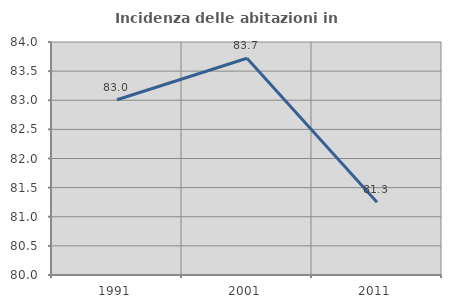
| Category | Incidenza delle abitazioni in proprietà  |
|---|---|
| 1991.0 | 83.008 |
| 2001.0 | 83.721 |
| 2011.0 | 81.25 |